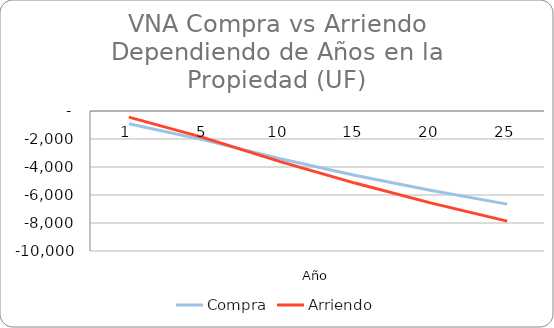
| Category | Compra | Arriendo |
|---|---|---|
| 1.0 | -905.199 | -440.014 |
| 5.0 | -2077.825 | -1917.613 |
| 10.0 | -3407.555 | -3616.941 |
| 15.0 | -4602.882 | -5165.775 |
| 20.0 | -5679.569 | -6577.443 |
| 25.0 | -6651.36 | -7864.091 |